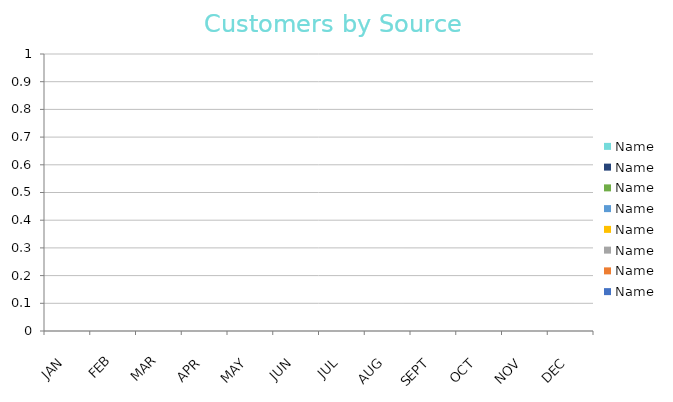
| Category | Name |
|---|---|
| JAN |  |
| FEB |  |
| MAR |  |
| APR |  |
| MAY |  |
| JUN |  |
| JUL |  |
| AUG |  |
| SEPT |  |
| OCT |  |
| NOV |  |
| DEC |  |